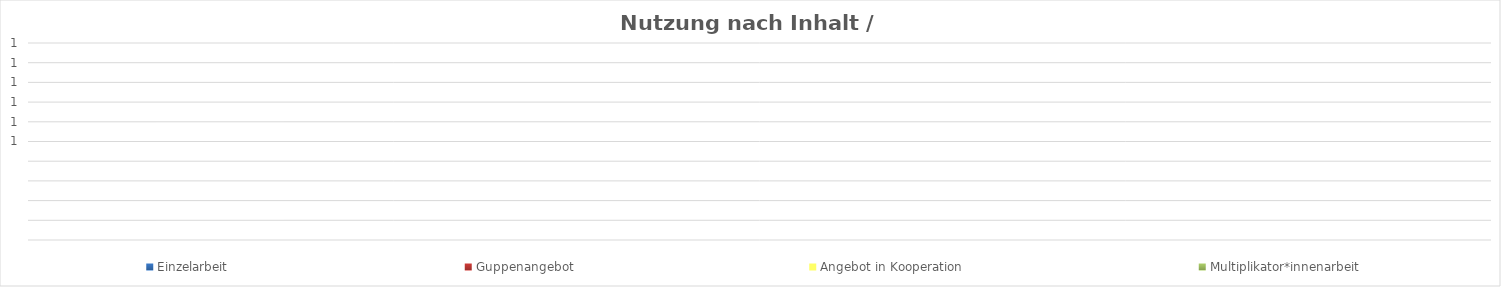
| Category | Einzelarbeit | Guppenangebot | Angebot in Kooperation | Multiplikator*innenarbeit |
|---|---|---|---|---|
| 0 | 0 | 0 | 0 | 0 |